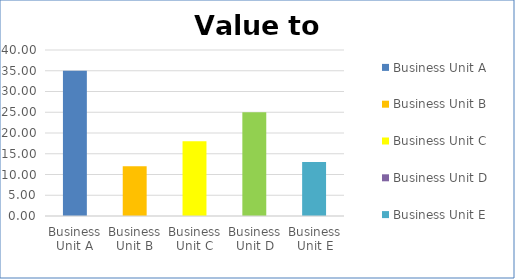
| Category | Business Unit A | Business Unit B | Business Unit C | Business Unit D | Business Unit E |
|---|---|---|---|---|---|
| Business Unit A | 35 | 0 | 0 | 0 | 0 |
| Business Unit B | 0 | 12 | 0 | 0 | 0 |
| Business Unit C | 0 | 0 | 18 | 0 | 0 |
| Business Unit D | 0 | 0 | 0 | 25 | 0 |
| Business Unit E | 0 | 0 | 0 | 0 | 13 |